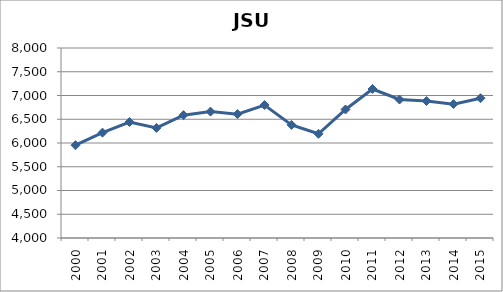
| Category | Series 0 |
|---|---|
| 2000.0 | 5953.542 |
| 2001.0 | 6217.875 |
| 2002.0 | 6441.367 |
| 2003.0 | 6317.633 |
| 2004.0 | 6586.217 |
| 2005.0 | 6660.542 |
| 2006.0 | 6607.904 |
| 2007.0 | 6798.55 |
| 2008.0 | 6381.883 |
| 2009.0 | 6193.721 |
| 2010.0 | 6705.421 |
| 2011.0 | 7136.892 |
| 2012.0 | 6915.417 |
| 2013.0 | 6883.233 |
| 2014.0 | 6818.562 |
| 2015.0 | 6942.846 |